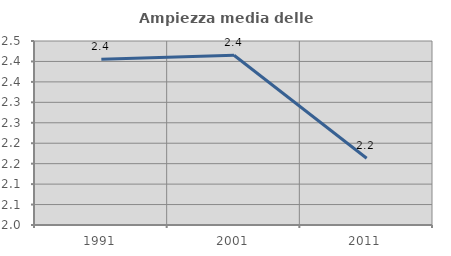
| Category | Ampiezza media delle famiglie |
|---|---|
| 1991.0 | 2.405 |
| 2001.0 | 2.415 |
| 2011.0 | 2.163 |